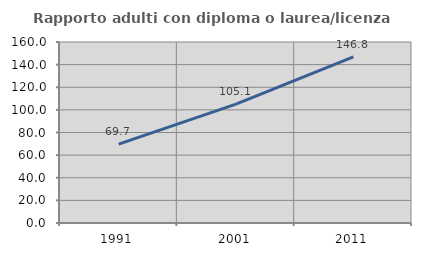
| Category | Rapporto adulti con diploma o laurea/licenza media  |
|---|---|
| 1991.0 | 69.688 |
| 2001.0 | 105.104 |
| 2011.0 | 146.822 |